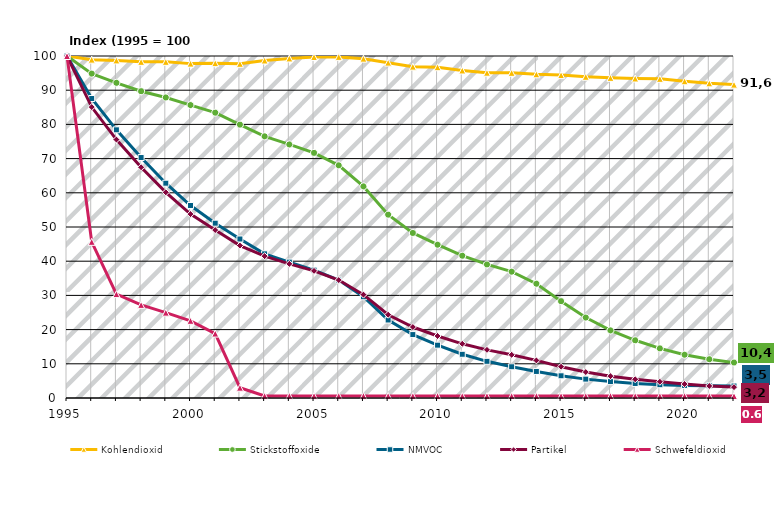
| Category | Kohlendioxid | Stickstoffoxide | NMVOC | Partikel | Schwefeldioxid |
|---|---|---|---|---|---|
| 1995.0 | 100 | 100 | 100 | 100 | 100 |
| nan | 98.931 | 94.854 | 87.567 | 85.073 | 45.662 |
| nan | 98.71 | 92.158 | 78.416 | 75.558 | 30.375 |
| nan | 98.289 | 89.708 | 70.308 | 67.465 | 27.221 |
| nan | 98.295 | 87.871 | 62.803 | 60.147 | 24.955 |
| 2000.0 | 97.771 | 85.652 | 56.288 | 53.773 | 22.572 |
| nan | 97.909 | 83.429 | 51.117 | 49.11 | 18.84 |
| nan | 97.718 | 79.933 | 46.493 | 44.573 | 3.009 |
| nan | 98.683 | 76.504 | 42.152 | 41.48 | 0.608 |
| nan | 99.287 | 74.138 | 39.732 | 39.209 | 0.612 |
| 2005.0 | 99.71 | 71.671 | 37.389 | 37.166 | 0.615 |
| nan | 99.74 | 68.029 | 34.467 | 34.481 | 0.617 |
| nan | 99.216 | 61.873 | 29.599 | 30.224 | 0.614 |
| nan | 98.057 | 53.607 | 22.805 | 24.352 | 0.606 |
| nan | 96.881 | 48.255 | 18.541 | 20.752 | 0.598 |
| 2010.0 | 96.724 | 44.83 | 15.448 | 18.132 | 0.597 |
| nan | 95.768 | 41.604 | 12.786 | 15.846 | 0.591 |
| nan | 95.106 | 39.054 | 10.725 | 14.078 | 0.587 |
| nan | 95.071 | 36.939 | 9.134 | 12.625 | 0.586 |
| nan | 94.651 | 33.42 | 7.763 | 10.993 | 0.584 |
| 2015.0 | 94.417 | 28.313 | 6.494 | 9.145 | 0.582 |
| nan | 93.919 | 23.522 | 5.52 | 7.581 | 0.579 |
| nan | 93.607 | 19.762 | 4.792 | 6.385 | 0.577 |
| nan | 93.419 | 16.873 | 4.245 | 5.481 | 0.576 |
| nan | 93.316 | 14.511 | 3.88 | 4.748 | 0.575 |
| 2020.0 | 92.608 | 12.661 | 3.669 | 4.083 | 0.57 |
| nan | 91.999 | 11.336 | 3.578 | 3.512 | 0.565 |
| nan | 91.621 | 10.372 | 3.511 | 3.171 | 0.562 |